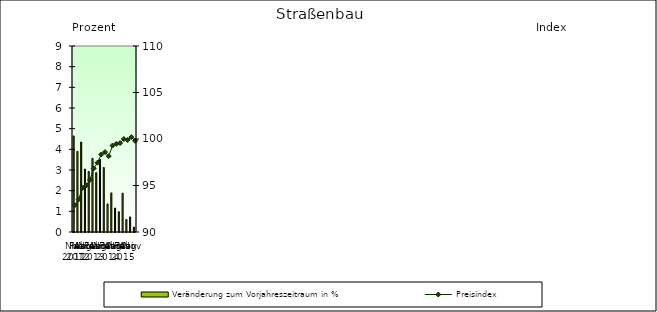
| Category | Veränderung zum Vorjahreszeitraum in % |
|---|---|
| 0 | 4.649 |
| 1 | 3.902 |
| 2 | 4.352 |
| 3 | 3.048 |
| 4 | 2.93 |
| 5 | 3.568 |
| 6 | 2.873 |
| 7 | 3.512 |
| 8 | 3.122 |
| 9 | 1.36 |
| 10 | 1.892 |
| 11 | 1.161 |
| 12 | 0.98 |
| 13 | 1.878 |
| 14 | 0.607 |
| 15 | 0.731 |
| 16 | 0.24 |